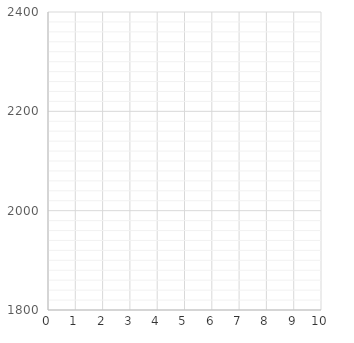
| Category | Series 0 |
|---|---|
| 0.0 | 0 |
| 0.0 | 0 |
| nan | 0 |
| nan | 0 |
| nan | 0 |
| nan | 0 |
| nan | 0 |
| nan | 0 |
| nan | 0 |